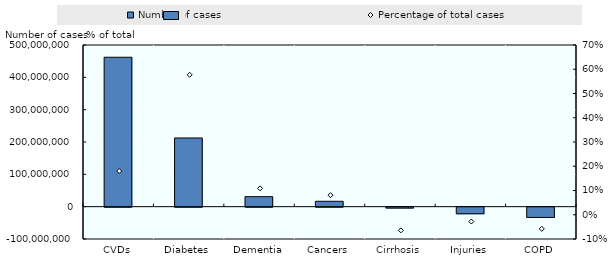
| Category | Number of cases |
|---|---|
| CVDs | 462099034.163 |
| Diabetes | 212433543.088 |
| Dementia | 30957526.648 |
| Cancers | 16649621.673 |
| Cirrhosis | -2772673.174 |
| Injuries | -20432751.397 |
| COPD | -31717576.214 |